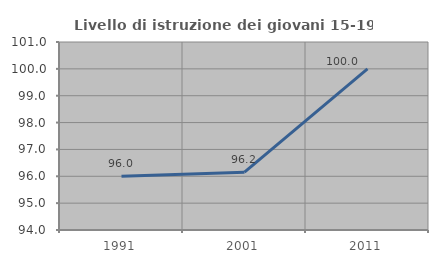
| Category | Livello di istruzione dei giovani 15-19 anni |
|---|---|
| 1991.0 | 96 |
| 2001.0 | 96.154 |
| 2011.0 | 100 |